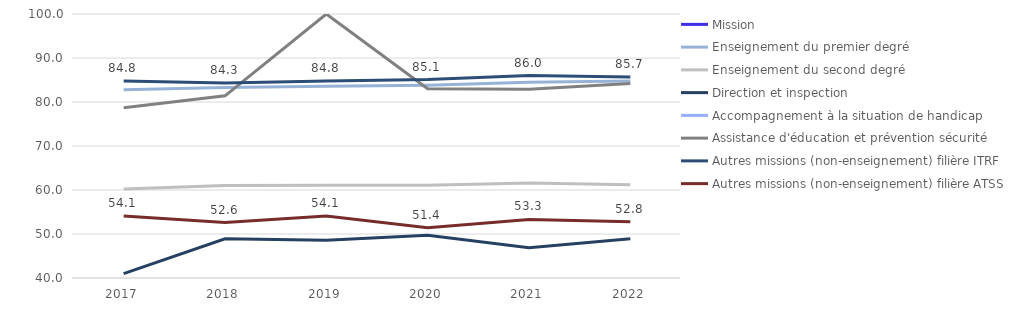
| Category | Mission | Enseignement du premier degré | Enseignement du second degré | Direction et inspection | Accompagnement à la situation de handicap | Assistance d'éducation et prévention sécurité | Autres missions (non-enseignement) filière ITRF | Autres missions (non-enseignement) filière ATSS |
|---|---|---|---|---|---|---|---|---|
| 2017.0 | 2017 | 82.8 | 60.2 | 41 |  | 78.7 | 84.8 | 54.1 |
| 2018.0 | 2018 | 83.3 | 61 | 48.9 |  | 81.4 | 84.3 | 52.6 |
| 2019.0 | 2019 | 83.6 | 61.1 | 48.6 |  | 100 | 84.8 | 54.1 |
| 2020.0 | 2020 | 83.8 | 61.1 | 49.7 |  | 83 | 85.1 | 51.4 |
| 2021.0 | 2021 | 84.5 | 61.6 | 46.9 |  | 82.9 | 86 | 53.3 |
| 2022.0 | 2022 | 84.8 | 61.2 | 48.9 |  | 84.2 | 85.7 | 52.8 |